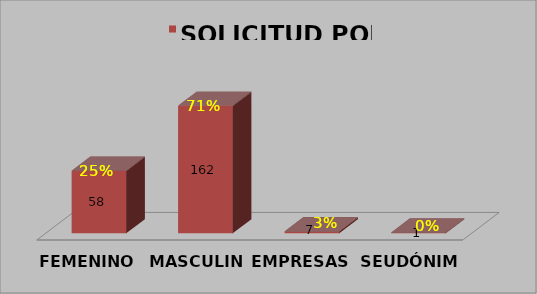
| Category | SOLICITUD POR GÉNERO |
|---|---|
| FEMENINO | 0.325 |
| MASCULINO | 0.662 |
| EMPRESAS | 0.01 |
| SEUDÓNIMO | 0.003 |